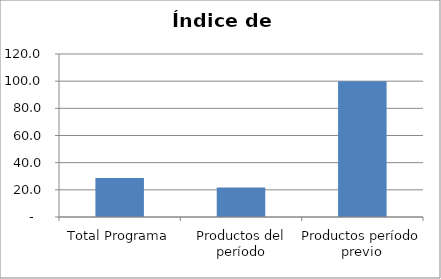
| Category | Índice de eficiencia (IE)  |
|---|---|
| Total Programa | 28.712 |
| Productos del período | 21.793 |
| Productos período previo | 100 |